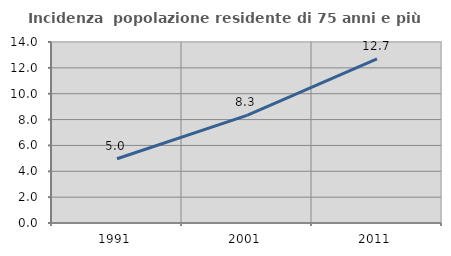
| Category | Incidenza  popolazione residente di 75 anni e più |
|---|---|
| 1991.0 | 4.973 |
| 2001.0 | 8.32 |
| 2011.0 | 12.702 |